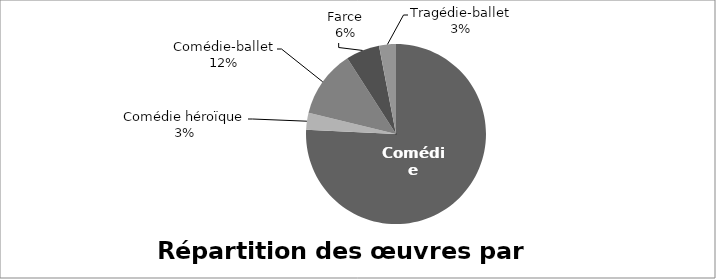
| Category | Répartition des œuvres par genre |
|---|---|
| Comédie | 25 |
| Comédie héroïque | 1 |
| Comédie-ballet | 4 |
| Farce | 2 |
| Tragédie-ballet | 1 |